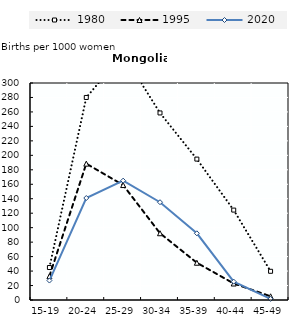
| Category | 1980 | 1995 | 2020 |
|---|---|---|---|
| 15-19 | 44.9 | 32.9 | 26.9 |
| 20-24 | 280 | 188.5 | 141 |
| 25-29 | 339.9 | 158.9 | 165 |
| 30-34 | 258.6 | 92.3 | 135.2 |
| 35-39 | 194.8 | 51.5 | 92.2 |
| 40-44 | 124.3 | 22.8 | 25.4 |
| 45-49 | 39.7 | 5.1 | 1.5 |